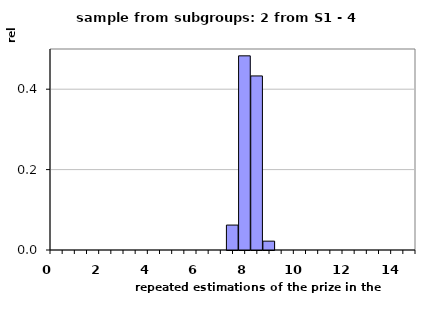
| Category | Method 2 |
|---|---|
| 0.0 | 0 |
| 0.5 | 0 |
| 1.0 | 0 |
| 1.5 | 0 |
| 2.0 | 0 |
| 2.5 | 0 |
| 3.0 | 0 |
| 3.5 | 0 |
| 4.0 | 0 |
| 4.5 | 0 |
| 5.0 | 0 |
| 5.5 | 0 |
| 6.0 | 0 |
| 6.5 | 0 |
| 7.0 | 0 |
| 7.5 | 0.062 |
| 8.0 | 0.483 |
| 8.5 | 0.433 |
| 9.0 | 0.022 |
| 9.5 | 0 |
| 10.0 | 0 |
| 10.5 | 0 |
| 11.0 | 0 |
| 11.5 | 0 |
| 12.0 | 0 |
| 12.5 | 0 |
| 13.0 | 0 |
| 13.5 | 0 |
| 14.0 | 0 |
| 14.5 | 0 |
| 15.0 | 0 |